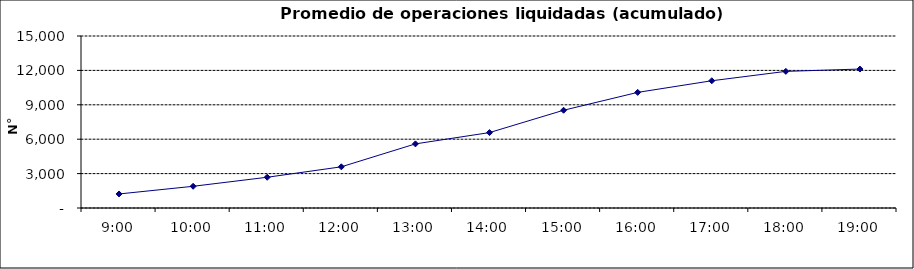
| Category | Promedio Op.Liquidadas (acumulado) |
|---|---|
| 0.375 | 1224.826 |
| 0.4166666666666667 | 1894 |
| 0.4583333333333333 | 2681.217 |
| 0.5 | 3591.348 |
| 0.5416666666666666 | 5591.435 |
| 0.5833333333333334 | 6576.261 |
| 0.625 | 8525.435 |
| 0.6666666666666666 | 10083.522 |
| 0.7083333333333334 | 11096.043 |
| 0.75 | 11915.565 |
| 0.7916666666666666 | 12118 |